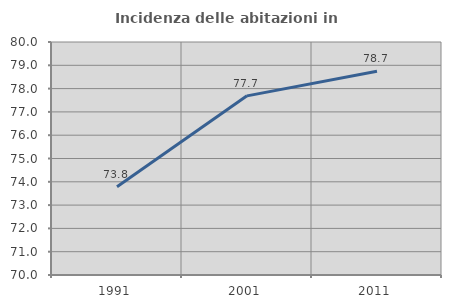
| Category | Incidenza delle abitazioni in proprietà  |
|---|---|
| 1991.0 | 73.79 |
| 2001.0 | 77.689 |
| 2011.0 | 78.742 |